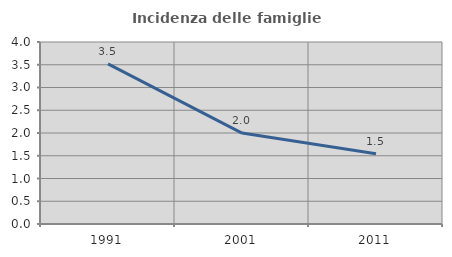
| Category | Incidenza delle famiglie numerose |
|---|---|
| 1991.0 | 3.519 |
| 2001.0 | 1.999 |
| 2011.0 | 1.542 |